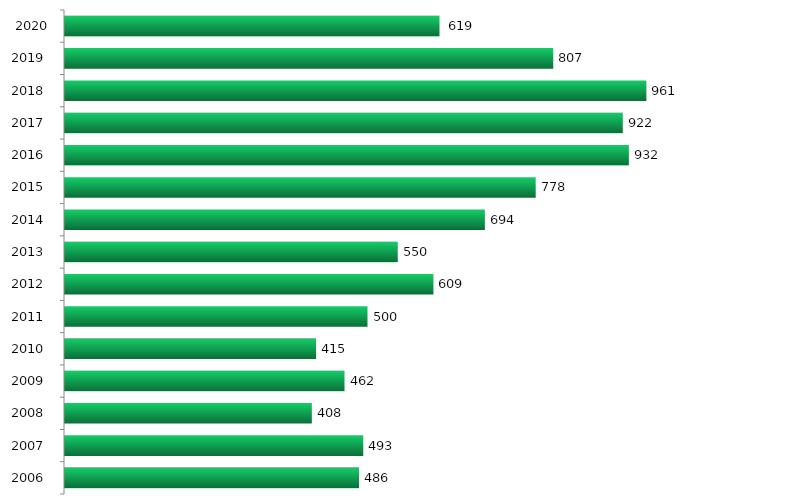
| Category | Series 0 |
|---|---|
| 2006.0 | 486 |
| 2007.0 | 493 |
| 2008.0 | 408 |
| 2009.0 | 462 |
| 2010.0 | 415 |
| 2011.0 | 500 |
| 2012.0 | 609 |
| 2013.0 | 550 |
| 2014.0 | 694 |
| 2015.0 | 778 |
| 2016.0 | 932 |
| 2017.0 | 922 |
| 2018.0 | 961 |
| 2019.0 | 807 |
| 2020.0 | 619 |